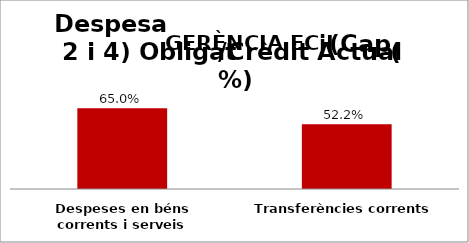
| Category | Series 0 |
|---|---|
| Despeses en béns corrents i serveis | 0.65 |
| Transferències corrents | 0.522 |